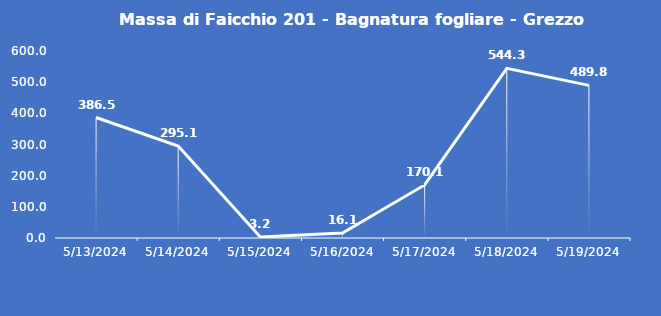
| Category | Massa di Faicchio 201 - Bagnatura fogliare - Grezzo (min) |
|---|---|
| 5/13/24 | 386.5 |
| 5/14/24 | 295.1 |
| 5/15/24 | 3.2 |
| 5/16/24 | 16.1 |
| 5/17/24 | 170.1 |
| 5/18/24 | 544.3 |
| 5/19/24 | 489.8 |